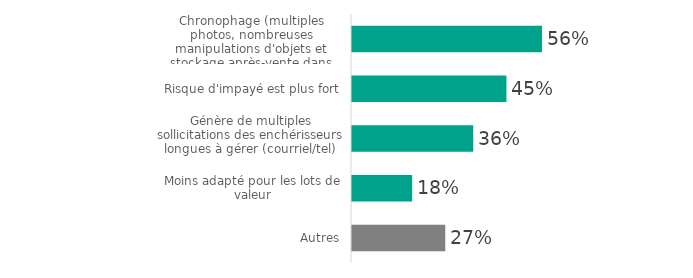
| Category | Series 0 |
|---|---|
| Chronophage (multiples photos, nombreuses manipulations d'objets et stockage après-vente dans l'attente de la livraison/retrait des lots..) | 55.874 |
| Risque d'impayé est plus fort | 45.427 |
| Génère de multiples sollicitations des enchérisseurs longues à gérer (courriel/tel) | 35.669 |
| Moins adapté pour les lots de valeur | 17.691 |
| Autres | 27.429 |